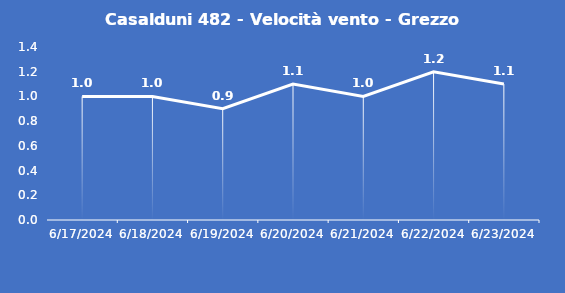
| Category | Casalduni 482 - Velocità vento - Grezzo (m/s) |
|---|---|
| 6/17/24 | 1 |
| 6/18/24 | 1 |
| 6/19/24 | 0.9 |
| 6/20/24 | 1.1 |
| 6/21/24 | 1 |
| 6/22/24 | 1.2 |
| 6/23/24 | 1.1 |